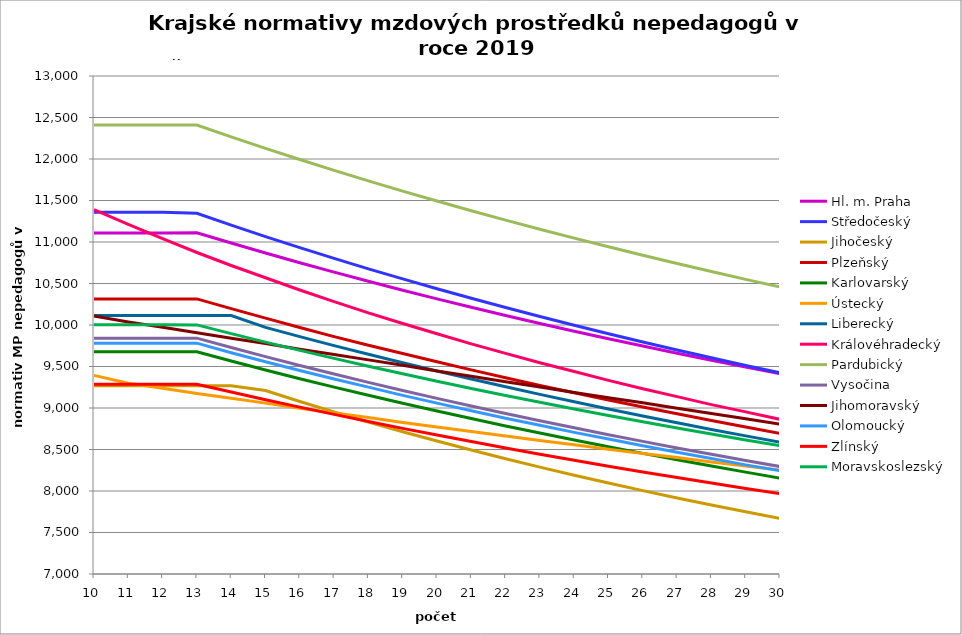
| Category | Hl. m. Praha | Středočeský | Jihočeský | Plzeňský | Karlovarský  | Ústecký   | Liberecký | Královéhradecký | Pardubický | Vysočina | Jihomoravský | Olomoucký | Zlínský | Moravskoslezský |
|---|---|---|---|---|---|---|---|---|---|---|---|---|---|---|
| 10.0 | 11109.441 | 11358.889 | 9267.509 | 10314.577 | 9676.562 | 9393.486 | 10113.352 | 11389.037 | 12408.336 | 9841.382 | 10108.319 | 9781.481 | 9286.742 | 10002.601 |
| 11.0 | 11109.441 | 11358.889 | 9267.509 | 10314.577 | 9676.562 | 9299.346 | 10113.352 | 11211.862 | 12408.336 | 9841.382 | 10035.904 | 9781.481 | 9286.742 | 10002.601 |
| 12.0 | 11109.441 | 11358.889 | 9267.509 | 10314.577 | 9676.562 | 9238.961 | 10113.352 | 11040.115 | 12408.336 | 9841.382 | 9972.864 | 9781.481 | 9286.742 | 10002.601 |
| 13.0 | 11111.32 | 11345.101 | 9267.509 | 10314.577 | 9676.648 | 9175.408 | 10113.442 | 10873.55 | 12408.446 | 9841.382 | 9906.489 | 9781.481 | 9286.742 | 10001.096 |
| 14.0 | 10987.337 | 11202.878 | 9267.509 | 10197.109 | 9565.606 | 9116.617 | 10113.557 | 10716.914 | 12266.056 | 9728.451 | 9840.992 | 9666.405 | 9192.038 | 9896.014 |
| 15.0 | 10866.988 | 11065.125 | 9210.044 | 10082.287 | 9457.821 | 9058.574 | 9971.097 | 10569.569 | 12127.843 | 9618.916 | 9776.355 | 9558.121 | 9099.877 | 9793.84 |
| 16.0 | 10750.127 | 10931.644 | 9078.972 | 9970.021 | 9353.159 | 8997.47 | 9859.802 | 10421.509 | 11993.634 | 9512.634 | 9708.602 | 9452.237 | 9010.164 | 9694.462 |
| 17.0 | 10636.614 | 10802.248 | 8952.877 | 9860.229 | 9251.493 | 8940.93 | 9751.714 | 10282.122 | 11863.267 | 9409.074 | 9645.687 | 9348.673 | 8922.81 | 9597.776 |
| 18.0 | 10526.316 | 10676.762 | 8831.502 | 9756.915 | 9152.704 | 8885.096 | 9646.703 | 10146.414 | 11736.589 | 9308.524 | 9579.726 | 9251.209 | 8837.728 | 9503.68 |
| 19.0 | 10419.108 | 10555.021 | 8714.604 | 9655.745 | 9056.679 | 8826.303 | 9544.649 | 10018.593 | 11613.455 | 9210.865 | 9514.662 | 9151.98 | 8754.838 | 9412.079 |
| 20.0 | 10314.871 | 10436.869 | 8601.96 | 9556.65 | 8963.31 | 8771.887 | 9445.434 | 9893.951 | 11493.727 | 9115.981 | 9446.727 | 9058.555 | 8674.062 | 9322.883 |
| 21.0 | 10213.494 | 10322.157 | 8493.359 | 9459.569 | 8872.494 | 8718.137 | 9348.95 | 9772.373 | 11377.274 | 9023.766 | 9383.452 | 8967.017 | 8595.325 | 9236.004 |
| 22.0 | 10114.868 | 10210.747 | 8388.608 | 9364.441 | 8784.137 | 8661.526 | 9255.093 | 9657.789 | 11263.972 | 8933.757 | 9317.371 | 8877.311 | 8518.559 | 9151.362 |
| 23.0 | 10018.892 | 10102.507 | 8287.522 | 9271.207 | 8698.146 | 8609.117 | 9163.764 | 9545.861 | 11153.705 | 8846.23 | 9252.214 | 8792.866 | 8443.694 | 9068.876 |
| 24.0 | 9925.471 | 9997.311 | 8189.931 | 9183.432 | 8614.433 | 8557.338 | 9074.869 | 9440.36 | 11046.359 | 8761.093 | 9187.963 | 8706.593 | 8370.669 | 8988.473 |
| 25.0 | 9834.511 | 9895.041 | 8095.673 | 9097.304 | 8532.917 | 8502.789 | 8988.319 | 9333.387 | 10941.83 | 8678.257 | 9124.598 | 8625.35 | 8299.42 | 8910.083 |
| 26.0 | 9745.927 | 9795.586 | 8004.599 | 9012.776 | 8453.517 | 8452.277 | 8904.03 | 9232.506 | 10840.016 | 8597.639 | 9062.1 | 8545.609 | 8229.891 | 8833.635 |
| 27.0 | 9659.634 | 9698.838 | 7916.567 | 8929.804 | 8376.16 | 8402.362 | 8821.92 | 9137.401 | 10740.82 | 8518.831 | 8997.053 | 8467.328 | 8162.024 | 8759.068 |
| 28.0 | 9575.553 | 9604.698 | 7831.445 | 8848.347 | 8300.774 | 8349.765 | 8741.914 | 9040.69 | 10644.151 | 8442.096 | 8932.933 | 8390.469 | 8095.767 | 8686.317 |
| 29.0 | 9493.61 | 9513.068 | 7749.107 | 8771.665 | 8227.29 | 8301.05 | 8663.937 | 8952.95 | 10549.923 | 8367.362 | 8869.721 | 8314.993 | 8031.069 | 8615.324 |
| 30.0 | 9413.731 | 9423.857 | 7669.435 | 8693.055 | 8155.644 | 8252.9 | 8587.921 | 8863.49 | 10458.051 | 8294.559 | 8804.14 | 8243.924 | 7967.88 | 8546.034 |